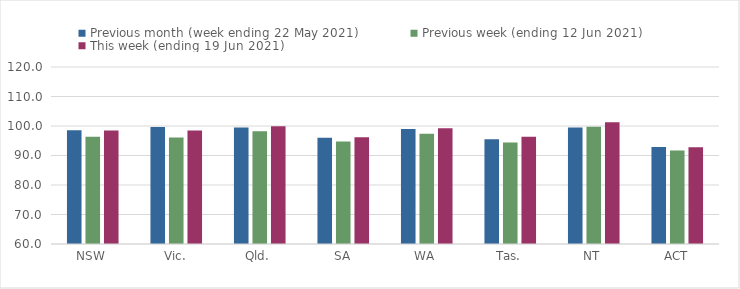
| Category | Previous month (week ending 22 May 2021) | Previous week (ending 12 Jun 2021) | This week (ending 19 Jun 2021) |
|---|---|---|---|
| NSW | 98.59 | 96.33 | 98.46 |
| Vic. | 99.67 | 96.06 | 98.49 |
| Qld. | 99.45 | 98.25 | 99.92 |
| SA | 96.03 | 94.76 | 96.17 |
| WA | 99.02 | 97.34 | 99.22 |
| Tas. | 95.54 | 94.42 | 96.32 |
| NT | 99.51 | 99.71 | 101.25 |
| ACT | 92.85 | 91.72 | 92.82 |